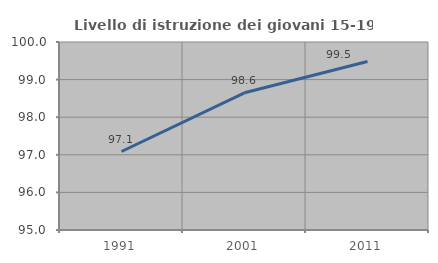
| Category | Livello di istruzione dei giovani 15-19 anni |
|---|---|
| 1991.0 | 97.087 |
| 2001.0 | 98.649 |
| 2011.0 | 99.482 |